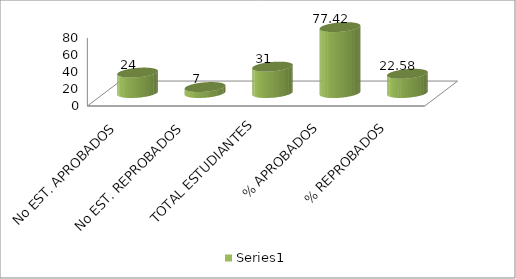
| Category | Series 0 |
|---|---|
| No EST. APROBADOS | 24 |
| No EST. REPROBADOS | 7 |
| TOTAL ESTUDIANTES | 31 |
| % APROBADOS | 77.419 |
| % REPROBADOS | 22.581 |